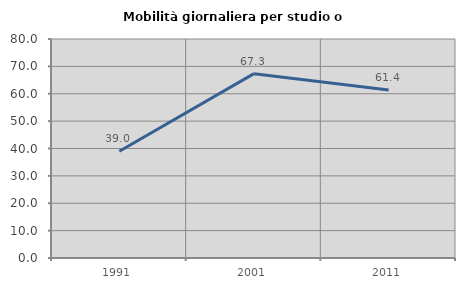
| Category | Mobilità giornaliera per studio o lavoro |
|---|---|
| 1991.0 | 38.995 |
| 2001.0 | 67.347 |
| 2011.0 | 61.386 |